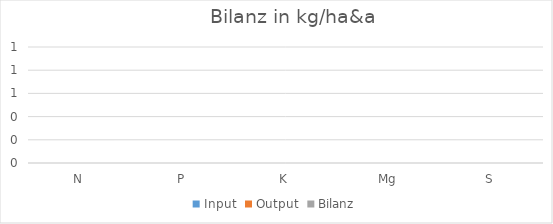
| Category | Input | Output | Bilanz |
|---|---|---|---|
| N | 0 | 0 | 0 |
| P | 0 | 0 | 0 |
| K | 0 | 0 | 0 |
| Mg | 0 | 0 | 0 |
| S | 0 | 0 | 0 |